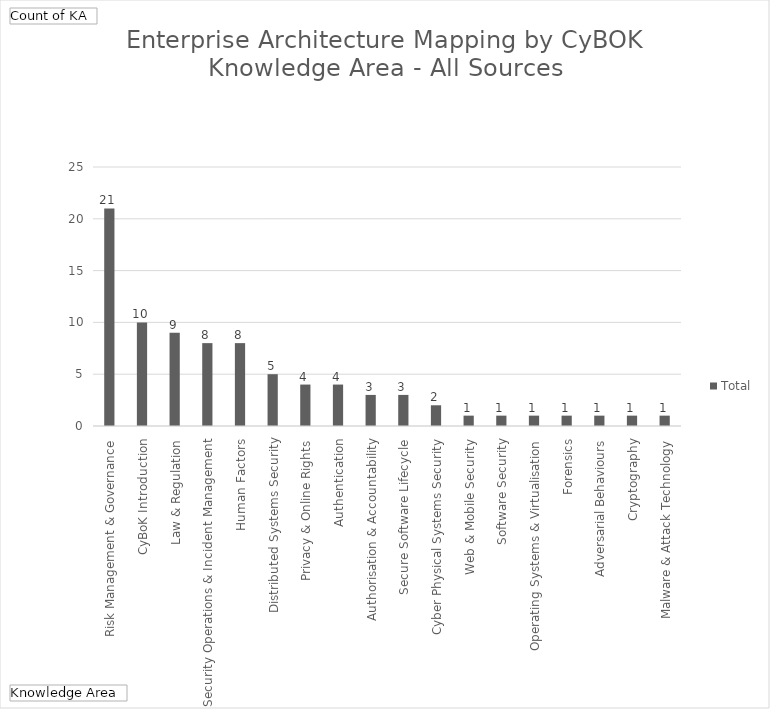
| Category | Total |
|---|---|
| Risk Management & Governance | 21 |
| CyBoK Introduction | 10 |
| Law & Regulation | 9 |
| Security Operations & Incident Management | 8 |
| Human Factors | 8 |
| Distributed Systems Security | 5 |
| Privacy & Online Rights | 4 |
| Authentication, Authorisation & Accountability | 4 |
| Secure Software Lifecycle | 3 |
| Cyber Physical Systems Security | 3 |
| Web & Mobile Security | 2 |
| Software Security | 1 |
| Operating Systems & Virtualisation | 1 |
| Forensics | 1 |
| Adversarial Behaviours | 1 |
| Cryptography | 1 |
| Malware & Attack Technology | 1 |
| Network Security | 1 |